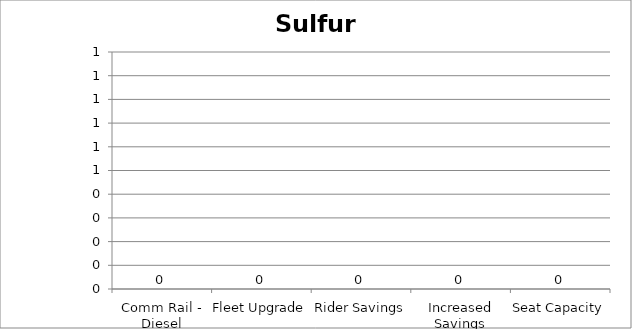
| Category | Sulfur Oxides |
|---|---|
| Comm Rail - Diesel | 0 |
| Fleet Upgrade | 0 |
| Rider Savings | 0 |
| Increased Savings | 0 |
| Seat Capacity | 0 |